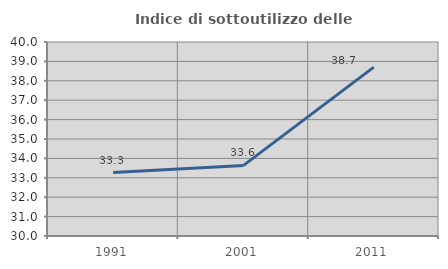
| Category | Indice di sottoutilizzo delle abitazioni  |
|---|---|
| 1991.0 | 33.272 |
| 2001.0 | 33.639 |
| 2011.0 | 38.706 |